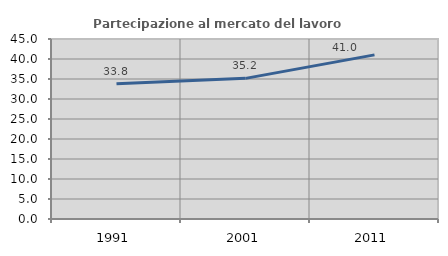
| Category | Partecipazione al mercato del lavoro  femminile |
|---|---|
| 1991.0 | 33.827 |
| 2001.0 | 35.16 |
| 2011.0 | 41.037 |